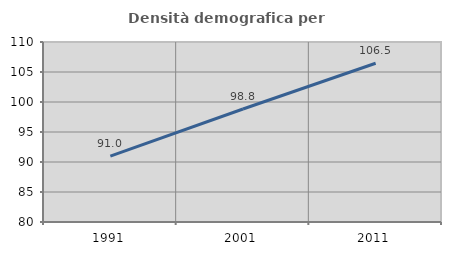
| Category | Densità demografica |
|---|---|
| 1991.0 | 90.969 |
| 2001.0 | 98.829 |
| 2011.0 | 106.458 |